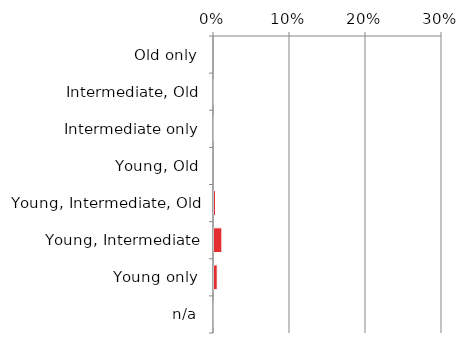
| Category | Near native & fragments |
|---|---|
| n/a | 0 |
| Young only | 0.006 |
| Young, Intermediate | 0.012 |
| Young, Intermediate, Old | 0.003 |
| Young, Old | 0 |
| Intermediate only | 0.001 |
| Intermediate, Old | 0.001 |
| Old only | 0 |